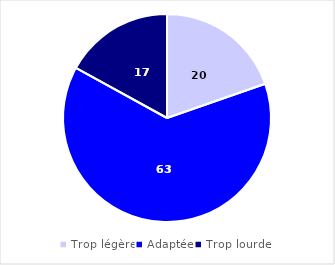
| Category | Series 0 |
|---|---|
| Trop légère | 19.67 |
| Adaptée | 63.32 |
| Trop lourde | 17.01 |